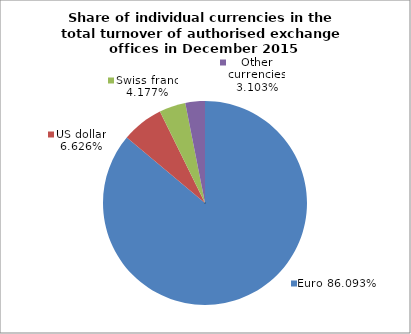
| Category | EUR |
|---|---|
| 0 | 0.861 |
| 1 | 0.066 |
| 2 | 0.042 |
| 3 | 0.031 |